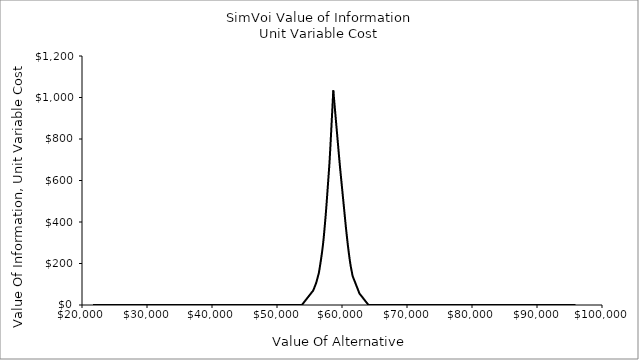
| Category | Unit Variable Cost |
|---|---|
| 21700.42155301782 | 0 |
| 21848.897025111157 | 0 |
| 21997.3724972045 | 0 |
| 22145.847969297836 | 0 |
| 22294.323441391174 | 0 |
| 22442.798913484516 | 0 |
| 22591.274385577854 | 0 |
| 22739.749857671195 | 0 |
| 22888.225329764533 | 0 |
| 23036.70080185787 | 0 |
| 23185.176273951212 | 0 |
| 23333.65174604455 | 0 |
| 23482.127218137888 | 0 |
| 23630.60269023123 | 0 |
| 23779.078162324568 | 0 |
| 23927.553634417905 | 0 |
| 24076.029106511247 | 0 |
| 24224.504578604585 | 0 |
| 24372.980050697923 | 0 |
| 24521.455522791264 | 0 |
| 24669.930994884602 | 0 |
| 24818.40646697794 | 0 |
| 24966.88193907128 | 0 |
| 25115.35741116462 | 0 |
| 25263.83288325796 | 0 |
| 25412.3083553513 | 0 |
| 25560.783827444637 | 0 |
| 25709.25929953798 | 0 |
| 25857.734771631316 | 0 |
| 26006.210243724658 | 0 |
| 26154.685715817996 | 0 |
| 26303.161187911333 | 0 |
| 26451.636660004675 | 0 |
| 26600.112132098013 | 0 |
| 26748.58760419135 | 0 |
| 26897.063076284692 | 0 |
| 27045.53854837803 | 0 |
| 27194.014020471368 | 0 |
| 27342.48949256471 | 0 |
| 27490.964964658047 | 0 |
| 27639.440436751385 | 0 |
| 27787.915908844727 | 0 |
| 27936.391380938065 | 0 |
| 28084.866853031403 | 0 |
| 28233.342325124744 | 0 |
| 28381.817797218082 | 0 |
| 28530.29326931142 | 0 |
| 28678.76874140476 | 0 |
| 28827.2442134981 | 0 |
| 28975.719685591437 | 0 |
| 29124.19515768478 | 0 |
| 29272.670629778117 | 0 |
| 29421.146101871458 | 0 |
| 29569.621573964796 | 0 |
| 29718.097046058137 | 0 |
| 29866.572518151475 | 0 |
| 30015.047990244813 | 0 |
| 30163.523462338155 | 0 |
| 30311.998934431493 | 0 |
| 30460.47440652483 | 0 |
| 30608.949878618172 | 0 |
| 30757.42535071151 | 0 |
| 30905.900822804848 | 0 |
| 31054.37629489819 | 0 |
| 31202.851766991527 | 0 |
| 31351.327239084865 | 0 |
| 31499.802711178207 | 0 |
| 31648.278183271545 | 0 |
| 31796.753655364882 | 0 |
| 31945.229127458224 | 0 |
| 32093.704599551562 | 0 |
| 32242.1800716449 | 0 |
| 32390.65554373824 | 0 |
| 32539.13101583158 | 0 |
| 32687.606487924917 | 0 |
| 32836.08196001826 | 0 |
| 32984.5574321116 | 0 |
| 33133.032904204934 | 0 |
| 33281.508376298276 | 0 |
| 33429.98384839162 | 0 |
| 33578.45932048495 | 0 |
| 33726.93479257829 | 0 |
| 33875.410264671635 | 0 |
| 34023.885736764976 | 0 |
| 34172.36120885831 | 0 |
| 34320.83668095165 | 0 |
| 34469.312153044986 | 0 |
| 34617.78762513833 | 0 |
| 34766.26309723167 | 0 |
| 34914.73856932501 | 0 |
| 35063.214041418345 | 0 |
| 35211.68951351169 | 0 |
| 35360.16498560502 | 0 |
| 35508.64045769836 | 0 |
| 35657.115929791704 | 0 |
| 35805.591401885045 | 0 |
| 35954.06687397838 | 0 |
| 36102.54234607172 | 0 |
| 36251.017818165055 | 0 |
| 36399.4932902584 | 0 |
| 36547.96876235174 | 0 |
| 36696.44423444508 | 0 |
| 36844.919706538414 | 0 |
| 36993.395178631756 | 0 |
| 37141.8706507251 | 0 |
| 37290.34612281843 | 0 |
| 37438.82159491177 | 0 |
| 37587.297067005115 | 0 |
| 37735.772539098456 | 0 |
| 37884.24801119179 | 0 |
| 38032.72348328513 | 0 |
| 38181.198955378466 | 0 |
| 38329.67442747181 | 0 |
| 38478.14989956515 | 0 |
| 38626.62537165849 | 0 |
| 38775.100843751825 | 0 |
| 38923.57631584517 | 0 |
| 39072.0517879385 | 0 |
| 39220.52726003184 | 0 |
| 39369.002732125184 | 0 |
| 39517.478204218525 | 0 |
| 39665.95367631186 | 0 |
| 39814.4291484052 | 0 |
| 39962.904620498535 | 0 |
| 40111.38009259188 | 0 |
| 40259.85556468522 | 0 |
| 40408.33103677856 | 0 |
| 40556.8065088719 | 0 |
| 40705.281980965236 | 0 |
| 40853.75745305857 | 0 |
| 41002.23292515191 | 0 |
| 41150.70839724525 | 0 |
| 41299.183869338594 | 0 |
| 41447.659341431936 | 0 |
| 41596.13481352527 | 0 |
| 41744.61028561861 | 0 |
| 41893.085757711946 | 0 |
| 42041.56122980529 | 0 |
| 42190.03670189863 | 0 |
| 42338.51217399197 | 0 |
| 42486.987646085305 | 0 |
| 42635.463118178646 | 0 |
| 42783.93859027198 | 0 |
| 42932.41406236532 | 0 |
| 43080.88953445866 | 0 |
| 43229.365006552005 | 0 |
| 43377.84047864534 | 0 |
| 43526.31595073868 | 0 |
| 43674.791422832015 | 0 |
| 43823.26689492536 | 0 |
| 43971.7423670187 | 0 |
| 44120.21783911204 | 0 |
| 44268.69331120538 | 0 |
| 44417.168783298715 | 0 |
| 44565.64425539205 | 0 |
| 44714.11972748539 | 0 |
| 44862.59519957873 | 0 |
| 45011.070671672074 | 0 |
| 45159.546143765416 | 0 |
| 45308.02161585875 | 0 |
| 45456.49708795209 | 0 |
| 45604.972560045426 | 0 |
| 45753.44803213877 | 0 |
| 45901.92350423211 | 0 |
| 46050.39897632545 | 0 |
| 46198.874448418785 | 0 |
| 46347.349920512126 | 0 |
| 46495.82539260546 | 0 |
| 46644.3008646988 | 0 |
| 46792.77633679214 | 0 |
| 46941.251808885485 | 0 |
| 47089.72728097882 | 0 |
| 47238.20275307216 | 0 |
| 47386.678225165495 | 0 |
| 47535.15369725884 | 0 |
| 47683.62916935218 | 0 |
| 47832.10464144552 | 0 |
| 47980.58011353886 | 0 |
| 48129.055585632195 | 0 |
| 48277.53105772553 | 0 |
| 48426.00652981887 | 0 |
| 48574.48200191221 | 0 |
| 48722.957474005554 | 0 |
| 48871.432946098896 | 0 |
| 49019.90841819223 | 0 |
| 49168.383890285564 | 0 |
| 49316.859362378906 | 0 |
| 49465.33483447225 | 0 |
| 49613.81030656559 | 0 |
| 49762.28577865893 | 0 |
| 49910.761250752264 | 0 |
| 50059.236722845606 | 0 |
| 50207.71219493894 | 0 |
| 50356.18766703228 | 0 |
| 50504.66313912562 | 0 |
| 50653.138611218965 | 0 |
| 50801.6140833123 | 0 |
| 50950.08955540564 | 0 |
| 51098.565027498975 | 0 |
| 51247.040499592316 | 0 |
| 51395.51597168566 | 0 |
| 51543.991443779 | 0 |
| 51692.46691587234 | 0 |
| 51840.942387965675 | 0 |
| 51989.41786005901 | 0 |
| 52137.89333215235 | 0 |
| 52286.36880424569 | 0 |
| 52434.844276339034 | 0 |
| 52583.319748432375 | 0 |
| 52731.79522052571 | 0 |
| 52880.270692619044 | 0 |
| 53028.746164712386 | 0 |
| 53177.22163680573 | 0 |
| 53325.69710889907 | 0 |
| 53474.17258099241 | 0 |
| 53622.648053085744 | 0 |
| 53771.123525179086 | 0 |
| 53919.59899727242 | 3.814 |
| 54068.07446936576 | 9.753 |
| 54216.5499414591 | 15.692 |
| 54365.025413552445 | 21.631 |
| 54513.50088564578 | 27.57 |
| 54661.97635773912 | 33.509 |
| 54810.45182983246 | 39.448 |
| 54958.927301925796 | 45.387 |
| 55107.40277401914 | 51.326 |
| 55255.87824611248 | 57.265 |
| 55404.35371820581 | 63.204 |
| 55552.829190299155 | 69.143 |
| 55701.3046623925 | 80.13 |
| 55849.78013448583 | 92.008 |
| 55998.25560657917 | 103.886 |
| 56146.731078672514 | 119.792 |
| 56295.20655076585 | 137.609 |
| 56443.68202285919 | 155.426 |
| 56592.15749495253 | 183.42 |
| 56740.632967045865 | 213.115 |
| 56889.10843913921 | 245.518 |
| 57037.58391123255 | 281.152 |
| 57186.05938332588 | 324.294 |
| 57334.534855419224 | 375.926 |
| 57483.010327512566 | 429.378 |
| 57631.4857996059 | 489.889 |
| 57779.96127169924 | 555.218 |
| 57928.43674379258 | 620.548 |
| 58076.912215885925 | 686.903 |
| 58225.38768797926 | 770.611 |
| 58373.8631600726 | 859.696 |
| 58522.33863216594 | 948.781 |
| 58661.49398605371 | 1034.49 |
| 58670.814104259276 | 1031.134 |
| 58819.28957635262 | 977.683 |
| 58967.76504844596 | 924.232 |
| 59116.24052053929 | 870.781 |
| 59264.715992632635 | 817.33 |
| 59413.19146472598 | 763.879 |
| 59561.66693681931 | 710.427 |
| 59710.14240891265 | 659.158 |
| 59858.617881005994 | 611.646 |
| 60007.09335309933 | 564.134 |
| 60155.56882519267 | 516.622 |
| 60304.04429728601 | 469.11 |
| 60452.519769379345 | 421.597 |
| 60600.99524147269 | 374.085 |
| 60749.47071356603 | 330.847 |
| 60897.94618565936 | 289.274 |
| 61046.421657752704 | 251.636 |
| 61194.897129846046 | 216.746 |
| 61343.37260193938 | 187.051 |
| 61491.84807403272 | 162.731 |
| 61640.32354612606 | 139.378 |
| 61788.799018219404 | 127.274 |
| 61937.27449031274 | 115.396 |
| 62085.74996240608 | 103.518 |
| 62234.22543449942 | 91.64 |
| 62382.700906592756 | 79.761 |
| 62531.1763786861 | 67.883 |
| 62679.65185077944 | 56.005 |
| 62828.12732287277 | 49.816 |
| 62976.602794966115 | 43.877 |
| 63125.078267059456 | 37.938 |
| 63273.55373915279 | 31.999 |
| 63422.02921124613 | 26.06 |
| 63570.50468333947 | 20.121 |
| 63718.98015543281 | 14.182 |
| 63867.45562752615 | 8.243 |
| 64015.93109961949 | 2.304 |
| 64164.406571712825 | 0 |
| 64312.88204380617 | 0 |
| 64461.35751589951 | 0 |
| 64609.83298799284 | 0 |
| 64758.308460086184 | 0 |
| 64906.783932179525 | 0 |
| 65055.25940427286 | 0 |
| 65203.7348763662 | 0 |
| 65352.21034845954 | 0 |
| 65500.685820552884 | 0 |
| 65649.16129264623 | 0 |
| 65797.63676473955 | 0 |
| 65946.11223683291 | 0 |
| 66094.58770892624 | 0 |
| 66243.06318101958 | 0 |
| 66391.53865311292 | 0 |
| 66540.01412520625 | 0 |
| 66688.4895972996 | 0 |
| 66836.96506939293 | 0 |
| 66985.44054148627 | 0 |
| 67133.91601357961 | 0 |
| 67282.39148567295 | 0 |
| 67430.8669577663 | 0 |
| 67579.34242985962 | 0 |
| 67727.81790195298 | 0 |
| 67876.2933740463 | 0 |
| 68024.76884613965 | 0 |
| 68173.24431823299 | 0 |
| 68321.71979032631 | 0 |
| 68470.19526241967 | 0 |
| 68618.670734513 | 0 |
| 68767.14620660634 | 0 |
| 68915.62167869968 | 0 |
| 69064.09715079302 | 0 |
| 69212.57262288636 | 0 |
| 69361.04809497969 | 0 |
| 69509.52356707305 | 0 |
| 69657.99903916637 | 0 |
| 69806.47451125972 | 0 |
| 69954.94998335306 | 0 |
| 70103.4254554464 | 0 |
| 70251.90092753974 | 0 |
| 70400.37639963307 | 0 |
| 70548.85187172642 | 0 |
| 70697.32734381975 | 0 |
| 70845.80281591309 | 0 |
| 70994.27828800643 | 0 |
| 71142.75376009976 | 0 |
| 71291.22923219312 | 0 |
| 71439.70470428644 | 0 |
| 71588.18017637978 | 0 |
| 71736.65564847313 | 0 |
| 71885.13112056647 | 0 |
| 72033.60659265981 | 0 |
| 72182.08206475314 | 0 |
| 72330.55753684649 | 0 |
| 72479.03300893982 | 0 |
| 72627.50848103316 | 0 |
| 72775.9839531265 | 0 |
| 72924.45942521983 | 0 |
| 73072.93489731319 | 0 |
| 73221.41036940651 | 0 |
| 73369.88584149987 | 0 |
| 73518.3613135932 | 0 |
| 73666.83678568654 | 0 |
| 73815.31225777988 | 0 |
| 73963.7877298732 | 0 |
| 74112.26320196656 | 0 |
| 74260.73867405989 | 0 |
| 74409.21414615323 | 0 |
| 74557.68961824657 | 0 |
| 74706.16509033991 | 0 |
| 74854.64056243325 | 0 |
| 75003.11603452658 | 0 |
| 75151.59150661994 | 0 |
| 75300.06697871326 | 0 |
| 75448.5424508066 | 0 |
| 75597.01792289995 | 0 |
| 75745.49339499327 | 0 |
| 75893.96886708663 | 0 |
| 76042.44433917996 | 0 |
| 76190.9198112733 | 0 |
| 76339.39528336664 | 0 |
| 76487.87075545998 | 0 |
| 76636.34622755332 | 0 |
| 76784.82169964665 | 0 |
| 76933.29717174 | 0 |
| 77081.77264383333 | 0 |
| 77230.24811592668 | 0 |
| 77378.72358802002 | 0 |
| 77527.19906011336 | 0 |
| 77675.6745322067 | 0 |
| 77824.15000430003 | 0 |
| 77972.62547639338 | 0 |
| 78121.10094848671 | 0 |
| 78269.57642058005 | 0 |
| 78418.0518926734 | 0 |
| 78566.52736476672 | 0 |
| 78715.00283686008 | 0 |
| 78863.4783089534 | 0 |
| 79011.95378104674 | 0 |
| 79160.42925314009 | 0 |
| 79308.90472523343 | 0 |
| 79457.38019732677 | 0 |
| 79605.8556694201 | 0 |
| 79754.33114151345 | 0 |
| 79902.80661360678 | 0 |
| 80051.28208570012 | 0 |
| 80199.75755779346 | 0 |
| 80348.23302988679 | 0 |
| 80496.70850198015 | 0 |
| 80645.18397407347 | 0 |
| 80793.65944616683 | 0 |
| 80942.13491826016 | 0 |
| 81090.6103903535 | 0 |
| 81239.08586244684 | 0 |
| 81387.56133454017 | 0 |
| 81536.03680663352 | 0 |
| 81684.51227872685 | 0 |
| 81832.98775082019 | 0 |
| 81981.46322291353 | 0 |
| 82129.93869500687 | 0 |
| 82278.41416710021 | 0 |
| 82426.88963919354 | 0 |
| 82575.3651112869 | 0 |
| 82723.84058338022 | 0 |
| 82872.31605547357 | 0 |
| 83020.79152756691 | 0 |
| 83169.26699966023 | 0 |
| 83317.74247175359 | 0 |
| 83466.21794384692 | 0 |
| 83614.69341594026 | 0 |
| 83763.1688880336 | 0 |
| 83911.64436012694 | 0 |
| 84060.11983222028 | 0 |
| 84208.59530431361 | 0 |
| 84357.07077640697 | 0 |
| 84505.5462485003 | 0 |
| 84654.02172059364 | 0 |
| 84802.49719268698 | 0 |
| 84950.97266478032 | 0 |
| 85099.44813687366 | 0 |
| 85247.92360896699 | 0 |
| 85396.39908106034 | 0 |
| 85544.87455315367 | 0 |
| 85693.35002524701 | 0 |
| 85841.82549734035 | 0 |
| 85990.30096943368 | 0 |
| 86138.77644152704 | 0 |
| 86287.25191362036 | 0 |
| 86435.7273857137 | 0 |
| 86584.20285780705 | 0 |
| 86732.67832990039 | 0 |
| 86881.15380199373 | 0 |
| 87029.62927408706 | 0 |
| 87178.10474618041 | 0 |
| 87326.58021827374 | 0 |
| 87475.05569036708 | 0 |
| 87623.53116246042 | 0 |
| 87772.00663455376 | 0 |
| 87920.4821066471 | 0 |
| 88068.95757874043 | 0 |
| 88217.43305083377 | 0 |
| 88365.90852292711 | 0 |
| 88514.38399502046 | 0 |
| 88662.8594671138 | 0 |
| 88811.33493920714 | 0 |
| 88959.81041130047 | 0 |
| 89108.28588339381 | 0 |
| 89256.76135548715 | 0 |
| 89405.23682758049 | 0 |
| 89553.71229967383 | 0 |
| 89702.18777176717 | 0 |
| 89850.6632438605 | 0 |
| 89999.13871595384 | 0 |
| 90147.61418804718 | 0 |
| 90296.08966014053 | 0 |
| 90444.56513223387 | 0 |
| 90593.04060432721 | 0 |
| 90741.51607642055 | 0 |
| 90889.99154851388 | 0 |
| 91038.46702060722 | 0 |
| 91186.94249270056 | 0 |
| 91335.4179647939 | 0 |
| 91483.89343688724 | 0 |
| 91632.36890898058 | 0 |
| 91780.84438107391 | 0 |
| 91929.31985316725 | 0 |
| 92077.7953252606 | 0 |
| 92226.27079735394 | 0 |
| 92374.74626944728 | 0 |
| 92523.22174154062 | 0 |
| 92671.69721363395 | 0 |
| 92820.17268572729 | 0 |
| 92968.64815782063 | 0 |
| 93117.12362991397 | 0 |
| 93265.59910200731 | 0 |
| 93414.07457410065 | 0 |
| 93562.55004619398 | 0 |
| 93711.02551828732 | 0 |
| 93859.50099038066 | 0 |
| 94007.976462474 | 0 |
| 94156.45193456735 | 0 |
| 94304.92740666069 | 0 |
| 94453.40287875403 | 0 |
| 94601.87835084736 | 0 |
| 94750.3538229407 | 0 |
| 94898.82929503404 | 0 |
| 95047.30476712738 | 0 |
| 95195.78023922072 | 0 |
| 95344.25571131406 | 0 |
| 95492.73118340739 | 0 |
| 95641.20665550073 | 0 |
| 95789.68212759407 | 0 |
| 95938.15759968742 | 0 |